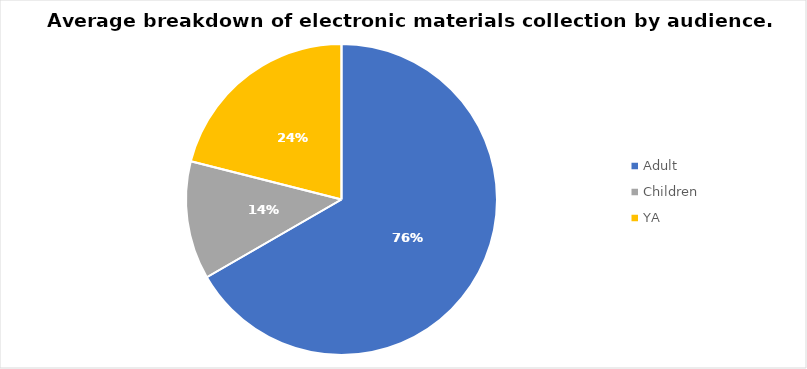
| Category | Series 0 |
|---|---|
| Adult | 0.76 |
| Children | 0.14 |
| YA | 0.24 |